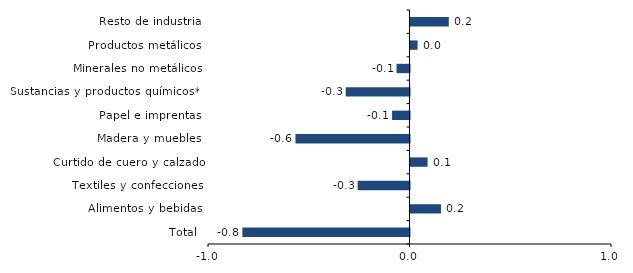
| Category | Series 0 |
|---|---|
| Total | -0.83 |
| Alimentos y bebidas | 0.151 |
| Textiles y confecciones | -0.257 |
| Curtido de cuero y calzado | 0.085 |
| Madera y muebles | -0.566 |
| Papel e imprentas | -0.087 |
| Sustancias y productos químicos** | -0.316 |
| Minerales no metálicos | -0.065 |
| Productos metálicos | 0.035 |
| Resto de industria | 0.19 |